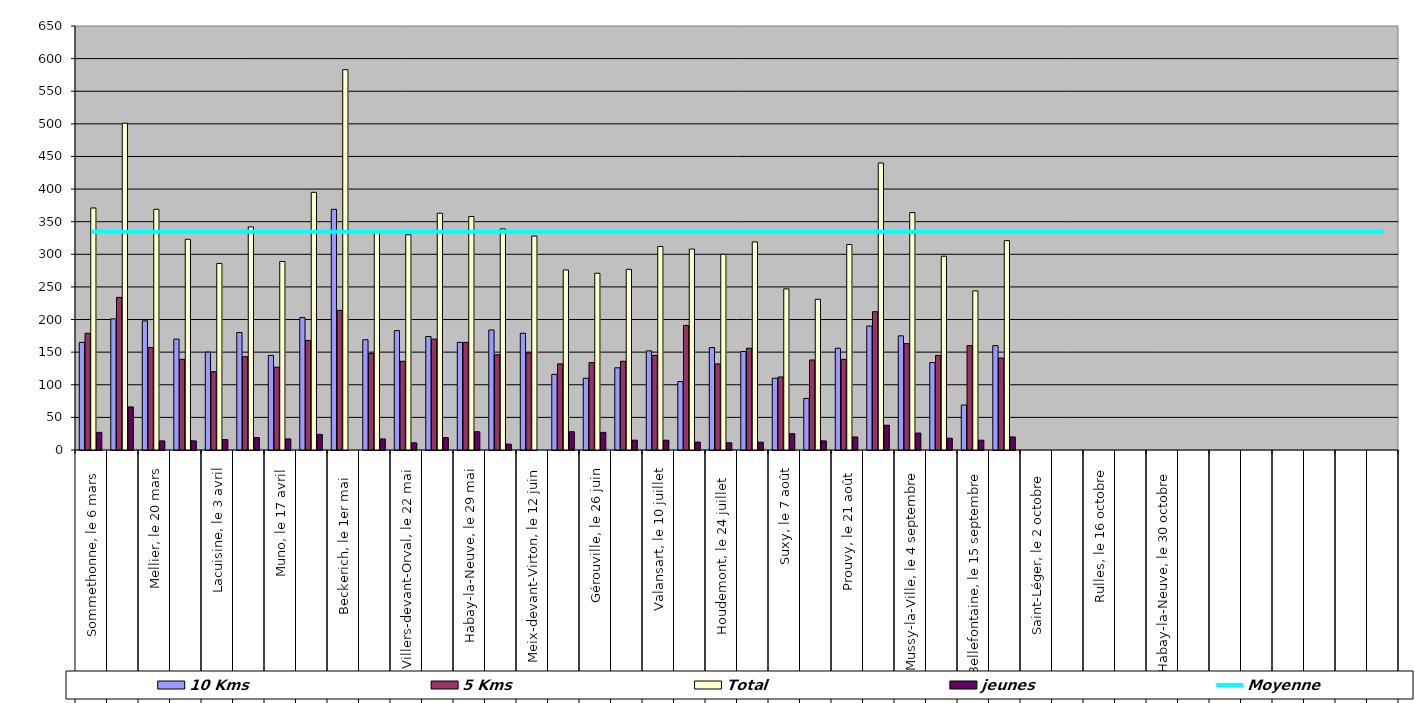
| Category | 10 Kms | 5 Kms | Total | jeunes |
|---|---|---|---|---|
| 0 | 165 | 179 | 371 | 27 |
| 1 | 201 | 234 | 501 | 66 |
| 2 | 198 | 157 | 369 | 14 |
| 3 | 170 | 139 | 323 | 14 |
| 4 | 150 | 120 | 286 | 16 |
| 5 | 180 | 143 | 342 | 19 |
| 6 | 145 | 127 | 289 | 17 |
| 7 | 203 | 168 | 395 | 24 |
| 8 | 369 | 214 | 583 | 0 |
| 9 | 169 | 148 | 334 | 17 |
| 10 | 183 | 136 | 330 | 11 |
| 11 | 174 | 170 | 363 | 19 |
| 12 | 165 | 165 | 358 | 28 |
| 13 | 184 | 146 | 339 | 9 |
| 14 | 179 | 149 | 328 | 0 |
| 15 | 116 | 132 | 276 | 28 |
| 16 | 110 | 134 | 271 | 27 |
| 17 | 126 | 136 | 277 | 15 |
| 18 | 152 | 145 | 312 | 15 |
| 19 | 105 | 191 | 308 | 12 |
| 20 | 157 | 132 | 300 | 11 |
| 21 | 151 | 156 | 319 | 12 |
| 22 | 110 | 112 | 247 | 25 |
| 23 | 79 | 138 | 231 | 14 |
| 24 | 156 | 139 | 315 | 20 |
| 25 | 190 | 212 | 440 | 38 |
| 26 | 175 | 163 | 364 | 26 |
| 27 | 134 | 145 | 297 | 18 |
| 28 | 69 | 160 | 244 | 15 |
| 29 | 160 | 141 | 321 | 20 |
| 30 | 0 | 0 | 0 | 0 |
| 31 | 0 | 0 | 0 | 0 |
| 32 | 0 | 0 | 0 | 0 |
| 33 | 0 | 0 | 0 | 0 |
| 34 | 0 | 0 | 0 | 0 |
| 35 | 0 | 0 | 0 | 0 |
| 36 | 0 | 0 | 0 | 0 |
| 37 | 0 | 0 | 0 | 0 |
| 38 | 0 | 0 | 0 | 0 |
| 39 | 0 | 0 | 0 | 0 |
| 40 | 0 | 0 | 0 | 0 |
| 41 | 0 | 0 | 0 | 0 |